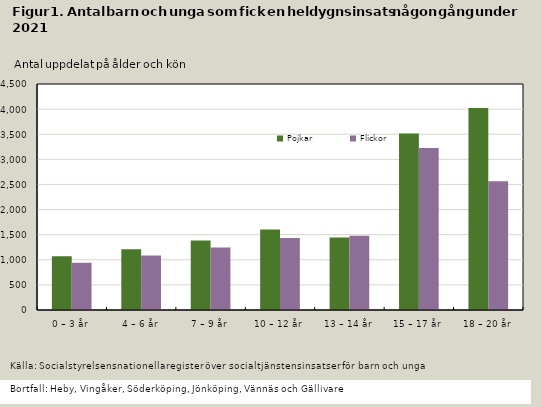
| Category | Pojkar | Flickor |
|---|---|---|
| 0 – 3 år | 1068 | 942 |
| 4 – 6 år | 1212 | 1083 |
| 7 – 9 år | 1382 | 1243 |
| 10 – 12 år | 1604 | 1434 |
| 13 – 14 år | 1443 | 1479 |
| 15 – 17 år | 3515 | 3224 |
| 18 – 20 år | 4021 | 2565 |